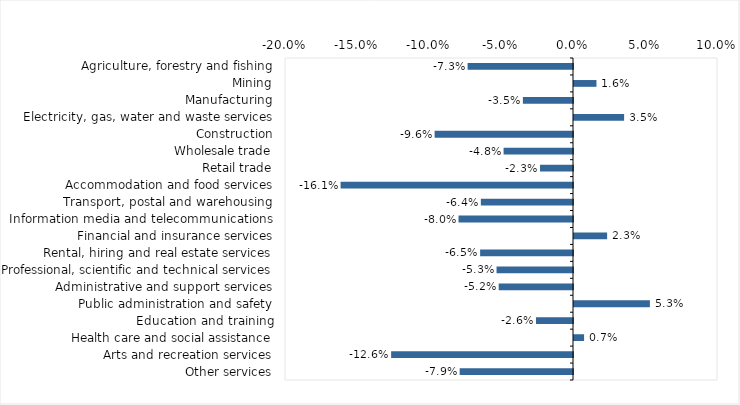
| Category | This week |
|---|---|
| Agriculture, forestry and fishing | -0.073 |
| Mining | 0.016 |
| Manufacturing | -0.035 |
| Electricity, gas, water and waste services | 0.035 |
| Construction | -0.096 |
| Wholesale trade | -0.048 |
| Retail trade | -0.023 |
| Accommodation and food services | -0.161 |
| Transport, postal and warehousing | -0.064 |
| Information media and telecommunications | -0.08 |
| Financial and insurance services | 0.023 |
| Rental, hiring and real estate services | -0.064 |
| Professional, scientific and technical services | -0.053 |
| Administrative and support services | -0.052 |
| Public administration and safety | 0.053 |
| Education and training | -0.026 |
| Health care and social assistance | 0.007 |
| Arts and recreation services | -0.126 |
| Other services | -0.079 |